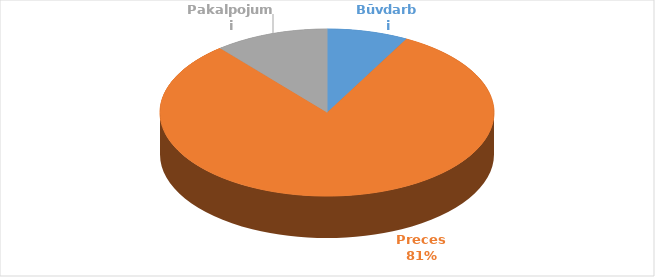
| Category | Noslēgto līgumu summa (EUR) | Īpatsvars, % |
|---|---|---|
| Būvdarbi | 28906121 | 0.079 |
| Preces | 298011400 | 0.811 |
| Pakalpojumi | 40658407 | 0.111 |